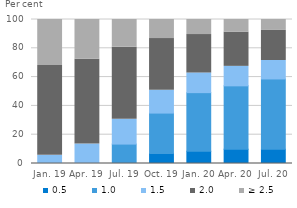
| Category | 0.5 | 1.0 | 1.5 | 2.0 | ≥ 2.5 |
|---|---|---|---|---|---|
| Jan. 19 | 0 | 0 | 5.68 | 62.389 | 31.931 |
| Apr. 19 | 0 | 0.084 | 13.449 | 58.869 | 27.598 |
| Jul. 19 | 0 | 13.48 | 17.207 | 50.05 | 19.263 |
| Oct. 19 | 6.983 | 28.025 | 15.869 | 35.859 | 13.265 |
| Jan. 20 | 8.504 | 40.705 | 13.692 | 26.611 | 10.488 |
| Apr. 20 | 9.922 | 44.009 | 13.526 | 23.764 | 8.779 |
| Jul. 20 | 9.853 | 48.858 | 12.833 | 20.878 | 7.578 |